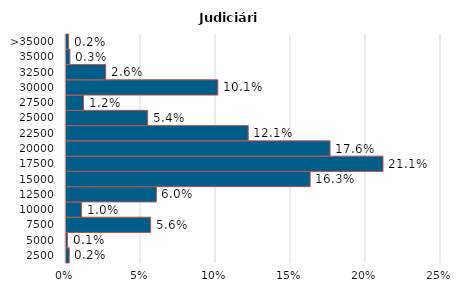
| Category | Judiciário |
|---|---|
| 2500 | 0.002 |
| 5000 | 0.001 |
| 7500 | 0.056 |
| 10000 | 0.01 |
| 12500 | 0.06 |
| 15000 | 0.163 |
| 17500 | 0.211 |
| 20000 | 0.176 |
| 22500 | 0.121 |
| 25000 | 0.054 |
| 27500 | 0.012 |
| 30000 | 0.101 |
| 32500 | 0.026 |
| 35000 | 0.003 |
| >35000 | 0.002 |